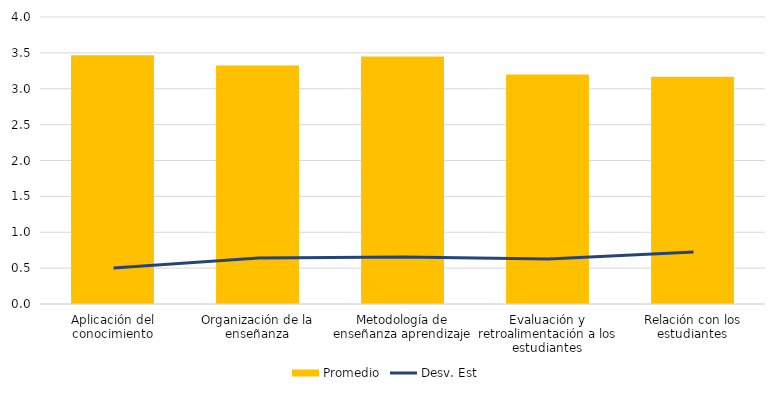
| Category | Promedio |
|---|---|
| Aplicación del conocimiento | 3.467 |
| Organización de la enseñanza | 3.325 |
| Metodología de enseñanza aprendizaje | 3.45 |
| Evaluación y retroalimentación a los estudiantes | 3.2 |
| Relación con los estudiantes | 3.167 |